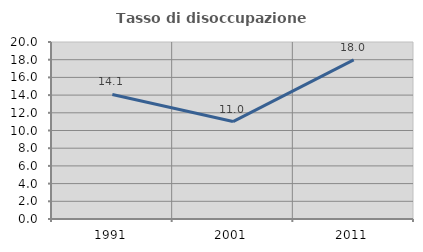
| Category | Tasso di disoccupazione giovanile  |
|---|---|
| 1991.0 | 14.078 |
| 2001.0 | 11.009 |
| 2011.0 | 17.978 |